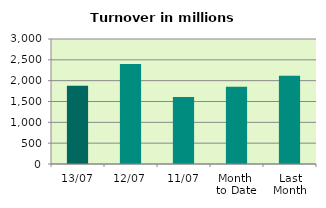
| Category | Series 0 |
|---|---|
| 13/07 | 1879.026 |
| 12/07 | 2397.198 |
| 11/07 | 1610.198 |
| Month 
to Date | 1856.777 |
| Last
Month | 2115.436 |